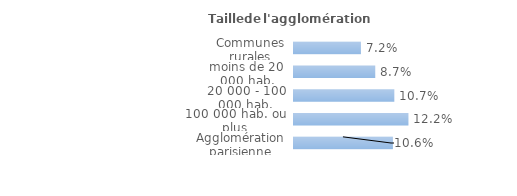
| Category | Series 0 |
|---|---|
| Communes rurales | 0.072 |
| moins de 20 000 hab. | 0.087 |
| 20 000 - 100 000 hab. | 0.107 |
| 100 000 hab. ou plus | 0.122 |
| Agglomération parisienne | 0.106 |